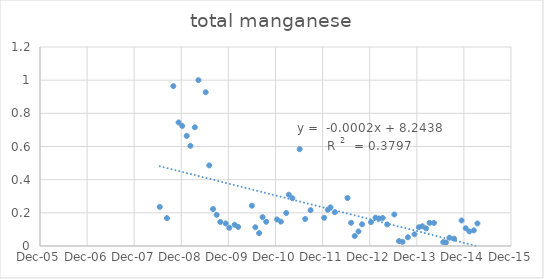
| Category | Series 0 |
|---|---|
| 39618.0 | 0.236 |
| 39674.0 | 0.168 |
| 39723.0 | 0.964 |
| 39764.0 | 0.745 |
| 39792.0 | 0.724 |
| 39827.0 | 0.664 |
| 39856.0 | 0.604 |
| 39890.0 | 0.716 |
| 39918.0 | 1 |
| 39974.0 | 0.927 |
| 40002.0 | 0.486 |
| 40031.0 | 0.223 |
| 40059.0 | 0.188 |
| 40087.0 | 0.145 |
| 40129.0 | 0.136 |
| 40157.0 | 0.11 |
| 40198.0 | 0.128 |
| 40226.0 | 0.115 |
| 40332.0 | 0.243 |
| 40359.0 | 0.113 |
| 40388.0 | 0.078 |
| 40415.0 | 0.174 |
| 40443.0 | 0.146 |
| 40527.0 | 0.16 |
| 40556.0 | 0.147 |
| 40598.0 | 0.199 |
| 40618.0 | 0.309 |
| 40646.0 | 0.288 |
| 40702.0 | 0.584 |
| 40745.0 | 0.163 |
| 40787.0 | 0.216 |
| 40892.0 | 0.17 |
| 40920.0 | 0.218 |
| 40941.0 | 0.233 |
| 40975.0 | 0.204 |
| 41073.0 | 0.289 |
| 41101.0 | 0.14 |
| 41129.0 | 0.06 |
| 41158.0 | 0.088 |
| 41186.0 | 0.131 |
| 41255.0 | 0.144 |
| 41290.0 | 0.171 |
| 41318.0 | 0.166 |
| 41346.0 | 0.169 |
| 41381.0 | 0.13 |
| 41436.0 | 0.19 |
| 41472.0 | 0.03 |
| 41500.0 | 0.025 |
| 41541.0 | 0.053 |
| 41592.0 | 0.07 |
| 41626.0 | 0.113 |
| 41653.0 | 0.119 |
| 41682.0 | 0.106 |
| 41709.0 | 0.14 |
| 41743.0 | 0.139 |
| 41815.0 | 0.024 |
| 41836.0 | 0.021 |
| 41863.0 | 0.05 |
| 41899.0 | 0.044 |
| 41957.0 | 0.154 |
| 41989.0 | 0.107 |
| 42017.0 | 0.088 |
| 42052.0 | 0.094 |
| 42080.0 | 0.136 |